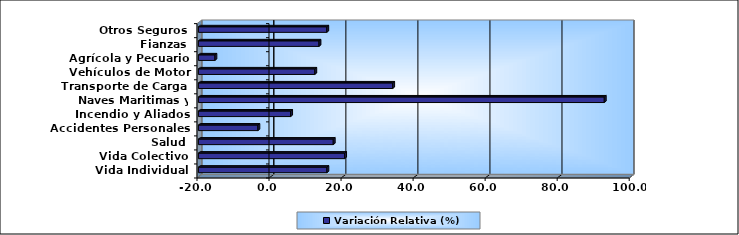
| Category | Variación Relativa (%) |
|---|---|
| Vida Individual | 15.666 |
| Vida Colectivo | 20.588 |
| Salud | 17.427 |
| Accidentes Personales | -3.491 |
| Incendio y Aliados | 5.6 |
| Naves Maritimas y Aéreas | 92.671 |
| Transporte de Carga | 33.933 |
| Vehículos de Motor | 12.307 |
| Agrícola y Pecuario | -15.424 |
| Fianzas | 13.476 |
| Otros Seguros | 15.635 |